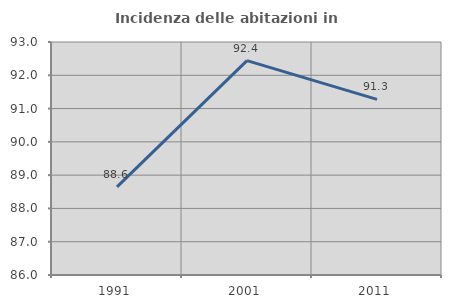
| Category | Incidenza delle abitazioni in proprietà  |
|---|---|
| 1991.0 | 88.649 |
| 2001.0 | 92.442 |
| 2011.0 | 91.275 |